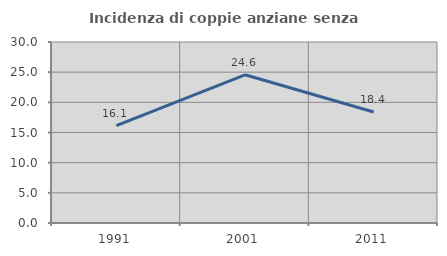
| Category | Incidenza di coppie anziane senza figli  |
|---|---|
| 1991.0 | 16.143 |
| 2001.0 | 24.567 |
| 2011.0 | 18.401 |